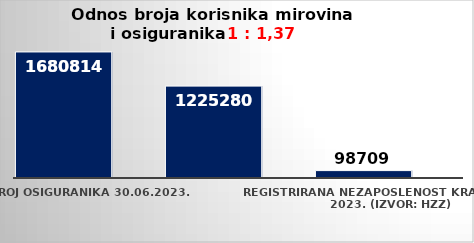
| Category | Series 0 | Series 1 |
|---|---|---|
| Broj osiguranika 30.06.2023. | 1680814 |  |
| Broj korisnika mirovine za lipanj 2023. (isplata u srpnju 2023.) | 1225280 |  |
| Registrirana nezaposlenost krajem lipnja 2023. (izvor: HZZ) | 98709 |  |